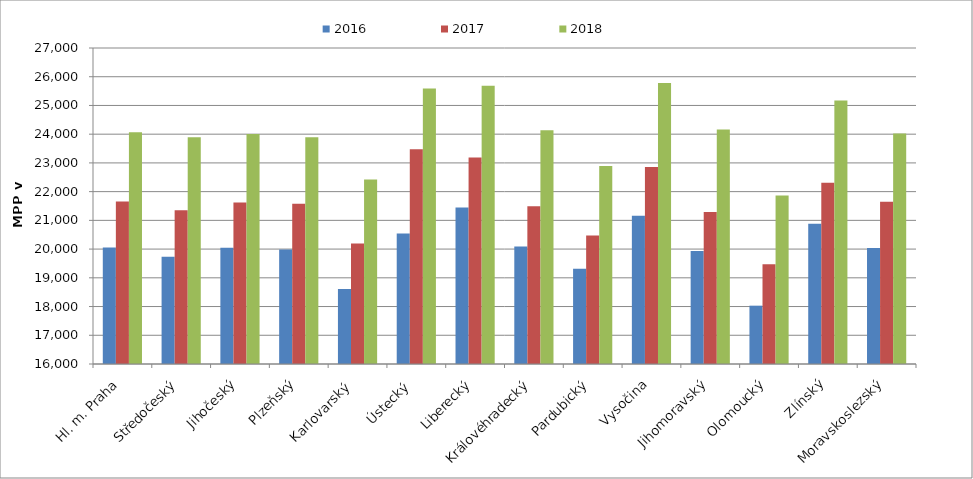
| Category | 2016 | 2017 | 2018 |
|---|---|---|---|
| Hl. m. Praha | 20051.91 | 21656.656 | 24063.775 |
| Středočeský | 19734.577 | 21349.412 | 23892.517 |
| Jihočeský | 20044.593 | 21624.954 | 24004.035 |
| Plzeňský | 19983.264 | 21582.068 | 23891.692 |
| Karlovarský  | 18613.008 | 20194.035 | 22421.847 |
| Ústecký   | 20544 | 23475.975 | 25588.501 |
| Liberecký | 21450.058 | 23191.231 | 25690.252 |
| Královéhradecký | 20092.473 | 21491.039 | 24139.068 |
| Pardubický | 19313.277 | 20476.848 | 22891.187 |
| Vysočina | 21162.441 | 22855.65 | 25781.119 |
| Jihomoravský | 19935.53 | 21292.271 | 24163.93 |
| Olomoucký | 18030.225 | 19472.669 | 21867.524 |
| Zlínský | 20879.151 | 22309.744 | 25175.83 |
| Moravskoslezský | 20041.289 | 21648.767 | 24021.711 |